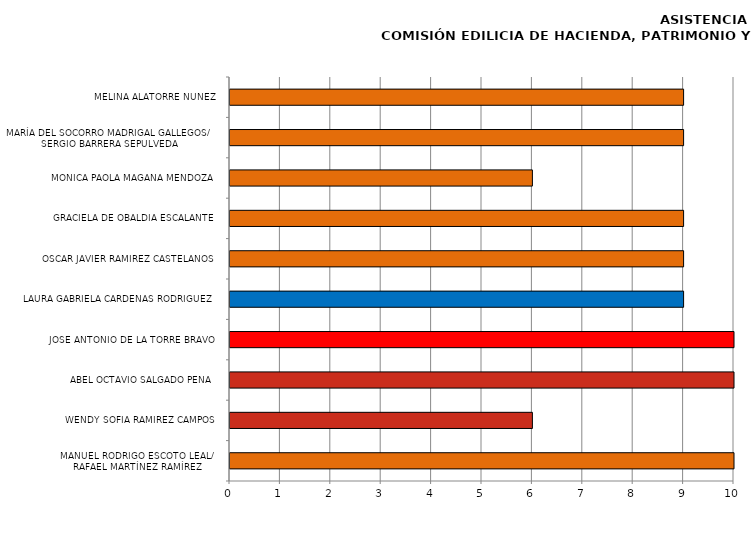
| Category | Series 0 |
|---|---|
| MANUEL RODRIGO ESCOTO LEAL/
RAFAEL MARTÍNEZ RAMÍREZ | 10 |
| WENDY SOFIA RAMÍREZ CAMPOS | 6 |
| ABEL OCTAVIO SALGADO PEÑA  | 10 |
| JOSÉ ANTONIO DE LA TORRE BRAVO | 10 |
| LAURA GABRIELA CARDENAS RODRIGUEZ | 9 |
| OSCAR JAVIER RAMÍREZ CASTELANOS | 9 |
| GRACIELA DE OBALDÍA ESCALANTE | 9 |
| MÓNICA PAOLA MAGAÑA MENDOZA | 6 |
| MARÍA DEL SOCORRO MADRIGAL GALLEGOS/
SERGIO BARRERA SEPULVEDA | 9 |
| MELINA ALATORRE NÚÑEZ | 9 |